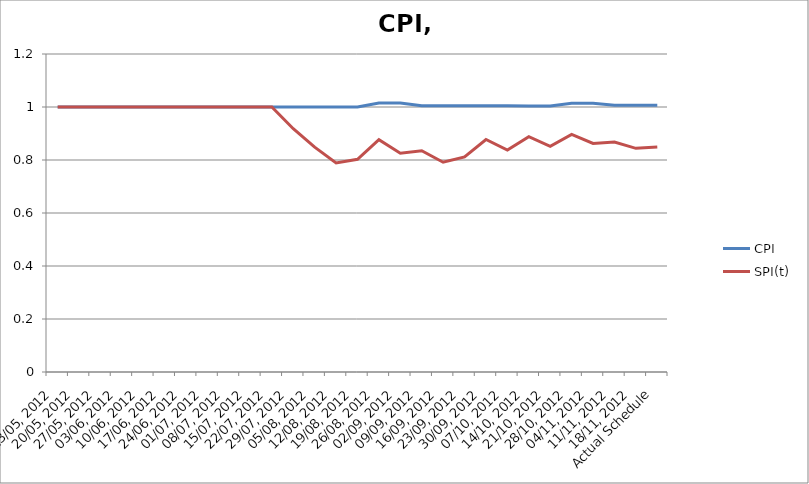
| Category | CPI | SPI(t) |
|---|---|---|
| 13/05, 2012 | 1 | 1 |
| 20/05, 2012 | 1 | 1 |
| 27/05, 2012 | 1 | 1 |
| 03/06, 2012 | 1 | 1 |
| 10/06, 2012 | 1 | 1 |
| 17/06, 2012 | 1 | 1 |
| 24/06, 2012 | 1 | 1 |
| 01/07, 2012 | 1 | 1 |
| 08/07, 2012 | 1 | 1 |
| 15/07, 2012 | 1 | 1 |
| 22/07, 2012 | 1 | 1 |
| 29/07, 2012 | 1 | 0.918 |
| 05/08, 2012 | 1 | 0.848 |
| 12/08, 2012 | 1 | 0.789 |
| 19/08, 2012 | 1 | 0.803 |
| 26/08, 2012 | 1.015 | 0.877 |
| 02/09, 2012 | 1.015 | 0.826 |
| 09/09, 2012 | 1.005 | 0.835 |
| 16/09, 2012 | 1.005 | 0.792 |
| 23/09, 2012 | 1.005 | 0.812 |
| 30/09, 2012 | 1.004 | 0.877 |
| 07/10, 2012 | 1.004 | 0.838 |
| 14/10, 2012 | 1.004 | 0.888 |
| 21/10, 2012 | 1.004 | 0.851 |
| 28/10, 2012 | 1.014 | 0.897 |
| 04/11, 2012 | 1.014 | 0.863 |
| 11/11, 2012 | 1.007 | 0.868 |
| 18/11, 2012 | 1.007 | 0.844 |
| Actual Schedule | 1.006 | 0.849 |